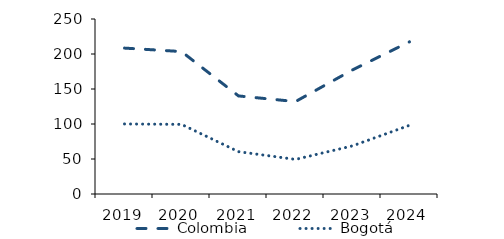
| Category | Colombia |
|---|---|
| 2019.0 | 208.438 |
| 2020.0 | 203.488 |
| 2021.0 | 140.105 |
| 2022.0 | 132.03 |
| 2023.0 | 177.246 |
| 2024.0 | 217.385 |